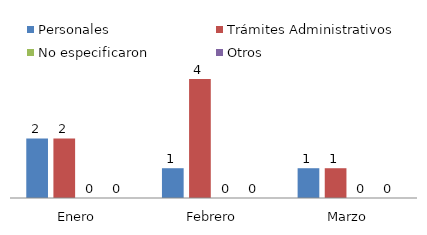
| Category | Personales | Trámites Administrativos | No especificaron | Otros |
|---|---|---|---|---|
| Enero | 2 | 2 | 0 | 0 |
| Febrero | 1 | 4 | 0 | 0 |
| Marzo | 1 | 1 | 0 | 0 |